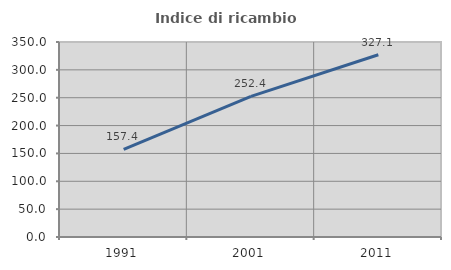
| Category | Indice di ricambio occupazionale  |
|---|---|
| 1991.0 | 157.36 |
| 2001.0 | 252.381 |
| 2011.0 | 327.083 |